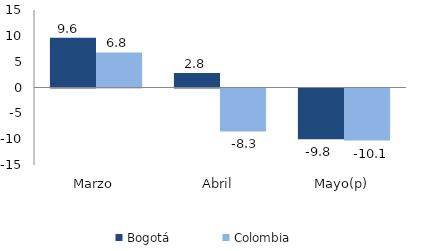
| Category | Bogotá | Colombia |
|---|---|---|
| Marzo | 9.644 | 6.784 |
| Abril | 2.818 | -8.305 |
| Mayo(p) | -9.827 | -10.065 |